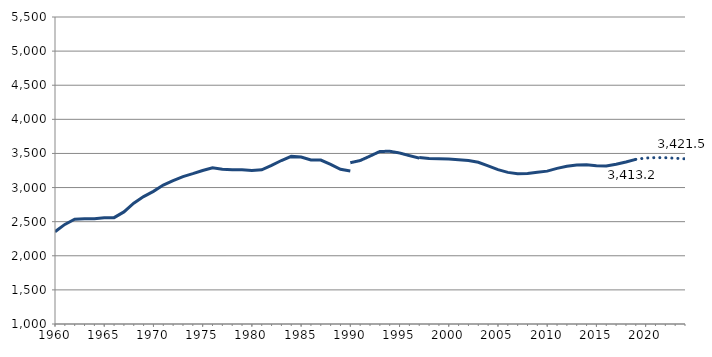
| Category | Collège |
|---|---|
| 1960.0 | 2353.066 |
| 1961.0 | 2459.745 |
| 1962.0 | 2536.686 |
| 1963.0 | 2543.658 |
| 1964.0 | 2542.774 |
| 1965.0 | 2557.456 |
| 1966.0 | 2558.861 |
| 1967.0 | 2643.057 |
| 1968.0 | 2770.318 |
| 1969.0 | 2868.135 |
| 1970.0 | 2943.957 |
| 1971.0 | 3036.162 |
| 1972.0 | 3102.185 |
| 1973.0 | 3161.132 |
| 1974.0 | 3203.458 |
| 1975.0 | 3250.361 |
| 1976.0 | 3290.649 |
| 1977.0 | 3268.172 |
| 1978.0 | 3261.253 |
| 1979.0 | 3259.95 |
| 1980.0 | 3249.311 |
| 1981.0 | 3259.686 |
| 1982.0 | 3325.425 |
| 1983.0 | 3396.597 |
| 1984.0 | 3456.879 |
| 1985.0 | 3448.697 |
| 1986.0 | 3405.086 |
| 1987.0 | 3402.769 |
| 1988.0 | 3339.178 |
| 1989.0 | 3268.167 |
| 1990.0 | 3243.539 |
| 1990.0 | 3363.973 |
| 1991.0 | 3395.982 |
| 1992.0 | 3461.082 |
| 1993.0 | 3528.723 |
| 1994.0 | 3531.901 |
| 1995.0 | 3506.915 |
| 1996.0 | 3467.995 |
| 1997.0 | 3432.138 |
| 1997.0 | 3441.665 |
| 1998.0 | 3426.101 |
| 1999.0 | 3422.362 |
| 2000.0 | 3419.106 |
| 2001.0 | 3407.581 |
| 2002.0 | 3396.158 |
| 2003.0 | 3370.53 |
| 2004.0 | 3319.109 |
| 2005.0 | 3262.786 |
| 2006.0 | 3222.51 |
| 2007.0 | 3204.024 |
| 2008.0 | 3206.925 |
| 2009.0 | 3224.187 |
| 2010.0 | 3240.664 |
| 2011.0 | 3280.919 |
| 2012.0 | 3312.292 |
| 2013.0 | 3331.95 |
| 2014.0 | 3335.247 |
| 2015.0 | 3318.548 |
| 2016.0 | 3315.007 |
| 2017.0 | 3342.346 |
| 2018.0 | 3374.409 |
| 2019.0 | 3413.156 |
| 2020.0 | 3432.898 |
| 2021.0 | 3439.06 |
| 2022.0 | 3437.693 |
| 2023.0 | 3429.58 |
| 2024.0 | 3421.519 |